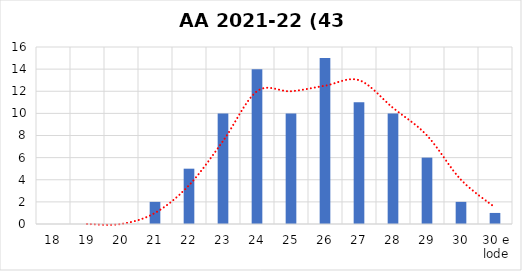
| Category | Series 0 |
|---|---|
| 18 | 0 |
| 19 | 0 |
| 20 | 0 |
| 21 | 2 |
| 22 | 5 |
| 23 | 10 |
| 24 | 14 |
| 25 | 10 |
| 26 | 15 |
| 27 | 11 |
| 28 | 10 |
| 29 | 6 |
| 30 | 2 |
| 30 e lode | 1 |